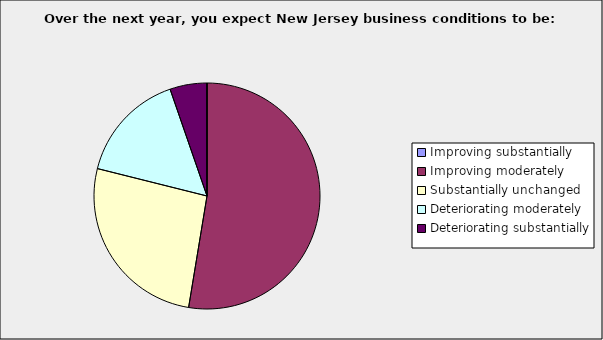
| Category | Series 0 |
|---|---|
| Improving substantially | 0 |
| Improving moderately | 0.526 |
| Substantially unchanged | 0.263 |
| Deteriorating moderately | 0.158 |
| Deteriorating substantially | 0.053 |